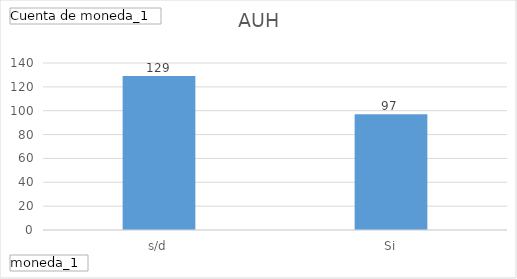
| Category | Total |
|---|---|
| s/d | 129 |
| Si | 97 |